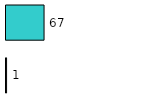
| Category | Series 0 | Series 1 |
|---|---|---|
| 0 | 1 | 67 |